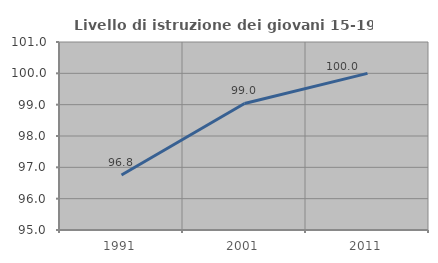
| Category | Livello di istruzione dei giovani 15-19 anni |
|---|---|
| 1991.0 | 96.753 |
| 2001.0 | 99.038 |
| 2011.0 | 100 |